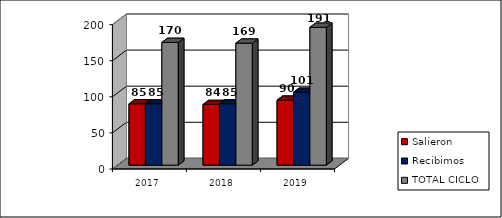
| Category | Salieron | Recibimos | TOTAL CICLO |
|---|---|---|---|
| 2017 | 85 | 85 | 170 |
| 2018 | 84 | 85 | 169 |
| 2019 | 90 | 101 | 191 |